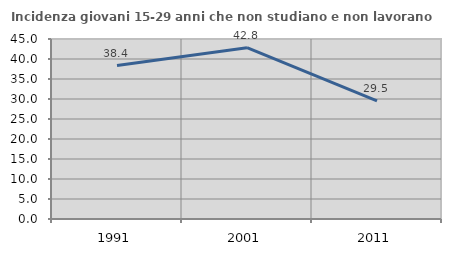
| Category | Incidenza giovani 15-29 anni che non studiano e non lavorano  |
|---|---|
| 1991.0 | 38.357 |
| 2001.0 | 42.831 |
| 2011.0 | 29.505 |